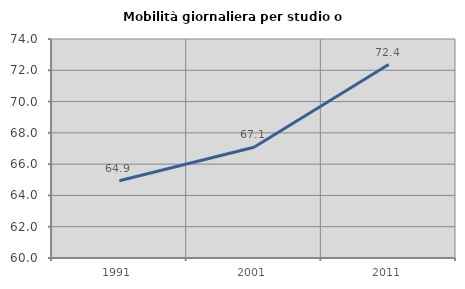
| Category | Mobilità giornaliera per studio o lavoro |
|---|---|
| 1991.0 | 64.943 |
| 2001.0 | 67.079 |
| 2011.0 | 72.364 |